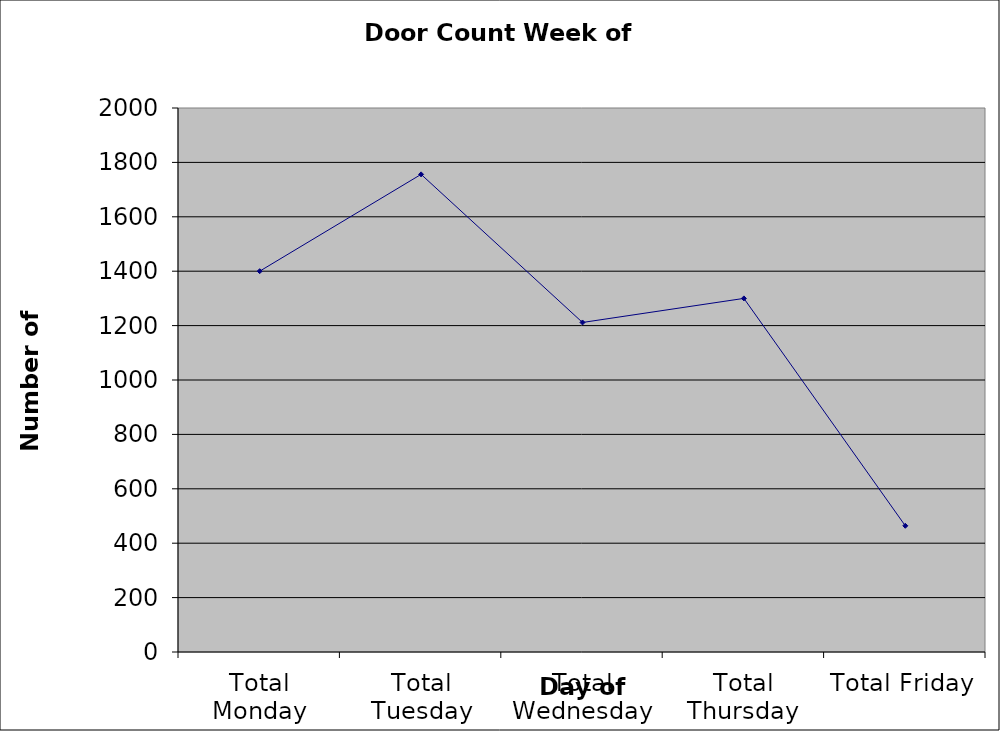
| Category | Series 0 |
|---|---|
| Total Monday | 1400 |
| Total Tuesday | 1756 |
| Total Wednesday | 1211.5 |
| Total Thursday | 1300 |
| Total Friday | 464 |